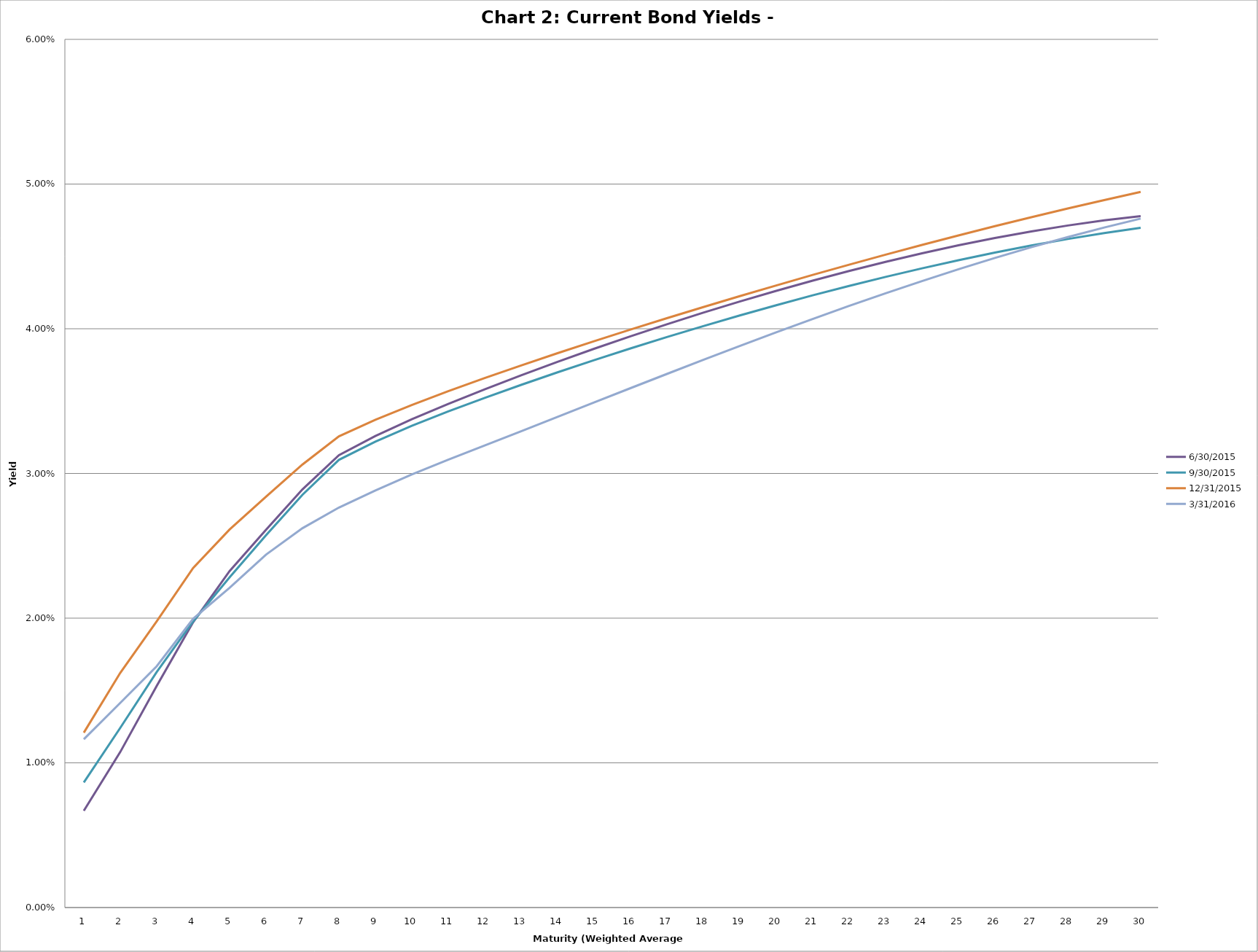
| Category | 6/30/2015 | 9/30/2015 | 12/31/2015 | 3/31/2016 |
|---|---|---|---|---|
| 0 | 0.007 | 0.009 | 0.012 | 0.012 |
| 1 | 0.011 | 0.012 | 0.016 | 0.014 |
| 2 | 0.015 | 0.016 | 0.02 | 0.017 |
| 3 | 0.02 | 0.02 | 0.023 | 0.02 |
| 4 | 0.023 | 0.023 | 0.026 | 0.022 |
| 5 | 0.026 | 0.026 | 0.028 | 0.024 |
| 6 | 0.029 | 0.029 | 0.031 | 0.026 |
| 7 | 0.031 | 0.031 | 0.033 | 0.028 |
| 8 | 0.033 | 0.032 | 0.034 | 0.029 |
| 9 | 0.034 | 0.033 | 0.035 | 0.03 |
| 10 | 0.035 | 0.034 | 0.036 | 0.031 |
| 11 | 0.036 | 0.035 | 0.037 | 0.032 |
| 12 | 0.037 | 0.036 | 0.037 | 0.033 |
| 13 | 0.038 | 0.037 | 0.038 | 0.034 |
| 14 | 0.039 | 0.038 | 0.039 | 0.035 |
| 15 | 0.039 | 0.039 | 0.04 | 0.036 |
| 16 | 0.04 | 0.039 | 0.041 | 0.037 |
| 17 | 0.041 | 0.04 | 0.042 | 0.038 |
| 18 | 0.042 | 0.041 | 0.042 | 0.039 |
| 19 | 0.043 | 0.042 | 0.043 | 0.04 |
| 20 | 0.043 | 0.042 | 0.044 | 0.041 |
| 21 | 0.044 | 0.043 | 0.044 | 0.042 |
| 22 | 0.045 | 0.044 | 0.045 | 0.042 |
| 23 | 0.045 | 0.044 | 0.046 | 0.043 |
| 24 | 0.046 | 0.045 | 0.046 | 0.044 |
| 25 | 0.046 | 0.045 | 0.047 | 0.045 |
| 26 | 0.047 | 0.046 | 0.048 | 0.046 |
| 27 | 0.047 | 0.046 | 0.048 | 0.046 |
| 28 | 0.047 | 0.047 | 0.049 | 0.047 |
| 29 | 0.048 | 0.047 | 0.049 | 0.048 |